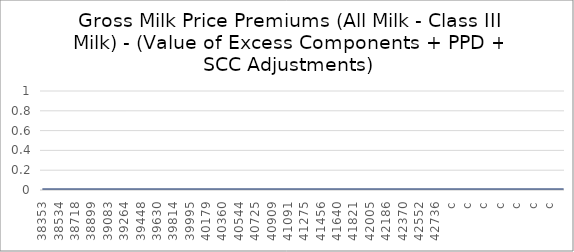
| Category | Series 0 |
|---|---|
| 38353.0 | 0 |
| 38384.0 | 0 |
| 38412.0 | 0 |
| 38443.0 | 0 |
| 38473.0 | 0 |
| 38504.0 | 0 |
| 38534.0 | 0 |
| 38565.0 | 0 |
| 38596.0 | 0 |
| 38626.0 | 0 |
| 38657.0 | 0 |
| 38687.0 | 0 |
| 38718.0 | 0 |
| 38749.0 | 0 |
| 38777.0 | 0 |
| 38808.0 | 0 |
| 38838.0 | 0 |
| 38869.0 | 0 |
| 38899.0 | 0 |
| 38930.0 | 0 |
| 38961.0 | 0 |
| 38991.0 | 0 |
| 39022.0 | 0 |
| 39052.0 | 0 |
| 39083.0 | 0 |
| 39114.0 | 0 |
| 39142.0 | 0 |
| 39173.0 | 0 |
| 39203.0 | 0 |
| 39234.0 | 0 |
| 39264.0 | 0 |
| 39295.0 | 0 |
| 39326.0 | 0 |
| 39356.0 | 0 |
| 39387.0 | 0 |
| 39417.0 | 0 |
| 39448.0 | 0 |
| 39479.0 | 0 |
| 39508.0 | 0 |
| 39539.0 | 0 |
| 39569.0 | 0 |
| 39600.0 | 0 |
| 39630.0 | 0 |
| 39661.0 | 0 |
| 39692.0 | 0 |
| 39722.0 | 0 |
| 39753.0 | 0 |
| 39783.0 | 0 |
| 39814.0 | 0 |
| 39845.0 | 0 |
| 39873.0 | 0 |
| 39904.0 | 0 |
| 39934.0 | 0 |
| 39965.0 | 0 |
| 39995.0 | 0 |
| 40026.0 | 0 |
| 40057.0 | 0 |
| 40087.0 | 0 |
| 40118.0 | 0 |
| 40148.0 | 0 |
| 40179.0 | 0 |
| 40210.0 | 0 |
| 40238.0 | 0 |
| 40269.0 | 0 |
| 40299.0 | 0 |
| 40330.0 | 0 |
| 40360.0 | 0 |
| 40391.0 | 0 |
| 40422.0 | 0 |
| 40452.0 | 0 |
| 40483.0 | 0 |
| 40513.0 | 0 |
| 40544.0 | 0 |
| 40575.0 | 0 |
| 40603.0 | 0 |
| 40634.0 | 0 |
| 40664.0 | 0 |
| 40695.0 | 0 |
| 40725.0 | 0 |
| 40756.0 | 0 |
| 40787.0 | 0 |
| 40817.0 | 0 |
| 40848.0 | 0 |
| 40878.0 | 0 |
| 40909.0 | 0 |
| 40940.0 | 0 |
| 40969.0 | 0 |
| 41000.0 | 0 |
| 41030.0 | 0 |
| 41061.0 | 0 |
| 41091.0 | 0 |
| 41122.0 | 0 |
| 41153.0 | 0 |
| 41183.0 | 0 |
| 41214.0 | 0 |
| 41244.0 | 0 |
| 41275.0 | 0 |
| 41306.0 | 0 |
| 41334.0 | 0 |
| 41365.0 | 0 |
| 41395.0 | 0 |
| 41426.0 | 0 |
| 41456.0 | 0 |
| 41487.0 | 0 |
| 41518.0 | 0 |
| 41548.0 | 0 |
| 41579.0 | 0 |
| 41609.0 | 0 |
| 41640.0 | 0 |
| 41671.0 | 0 |
| 41699.0 | 0 |
| 41730.0 | 0 |
| 41760.0 | 0 |
| 41791.0 | 0 |
| 41821.0 | 0 |
| 41852.0 | 0 |
| 41883.0 | 0 |
| 41913.0 | 0 |
| 41944.0 | 0 |
| 41974.0 | 0 |
| 42005.0 | 0 |
| 42036.0 | 0 |
| 42064.0 | 0 |
| 42095.0 | 0 |
| 42125.0 | 0 |
| 42156.0 | 0 |
| 42186.0 | 0 |
| 42217.0 | 0 |
| 42248.0 | 0 |
| 42278.0 | 0 |
| 42309.0 | 0 |
| 42339.0 | 0 |
| 42370.0 | 0 |
| 42401.0 | 0 |
| 42430.0 | 0 |
| 42461.0 | 0 |
| 42491.0 | 0 |
| 42522.0 | 0 |
| 42552.0 | 0 |
| 42583.0 | 0 |
| 42614.0 | 0 |
| 42644.0 | 0 |
| 42675.0 | 0 |
| 42705.0 | 0 |
| 42736.0 | 0 |
| 42767.0 | 0 |
| 42795.0 | 0 |
| #N/A | 0 |
| #N/A | 0 |
| #N/A | 0 |
| #N/A | 0 |
| #N/A | 0 |
| #N/A | 0 |
| #N/A | 0 |
| #N/A | 0 |
| #N/A | 0 |
| #N/A | 0 |
| #N/A | 0 |
| #N/A | 0 |
| #N/A | 0 |
| #N/A | 0 |
| #N/A | 0 |
| #N/A | 0 |
| #N/A | 0 |
| #N/A | 0 |
| #N/A | 0 |
| #N/A | 0 |
| #N/A | 0 |
| #N/A | 0 |
| #N/A | 0 |
| #N/A | 0 |
| #N/A | 0 |
| #N/A | 0 |
| #N/A | 0 |
| #N/A | 0 |
| #N/A | 0 |
| #N/A | 0 |
| #N/A | 0 |
| #N/A | 0 |
| #N/A | 0 |
| #N/A | 0 |
| #N/A | 0 |
| #N/A | 0 |
| #N/A | 0 |
| #N/A | 0 |
| #N/A | 0 |
| #N/A | 0 |
| #N/A | 0 |
| #N/A | 0 |
| #N/A | 0 |
| #N/A | 0 |
| #N/A | 0 |